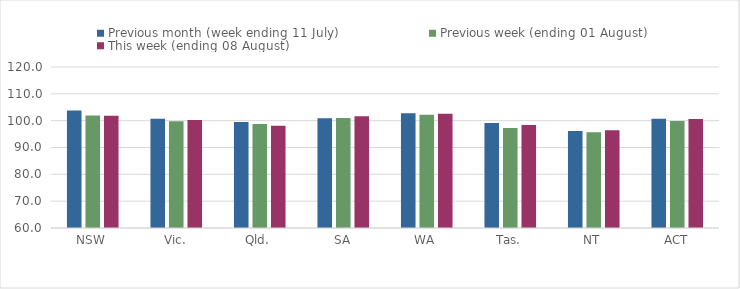
| Category | Previous month (week ending 11 July) | Previous week (ending 01 August) | This week (ending 08 August) |
|---|---|---|---|
| NSW | 103.749 | 101.97 | 101.857 |
| Vic. | 100.758 | 99.787 | 100.206 |
| Qld. | 99.545 | 98.774 | 98.108 |
| SA | 100.941 | 100.971 | 101.662 |
| WA | 102.786 | 102.196 | 102.608 |
| Tas. | 99.155 | 97.247 | 98.362 |
| NT | 96.112 | 95.68 | 96.382 |
| ACT | 100.669 | 99.897 | 100.635 |